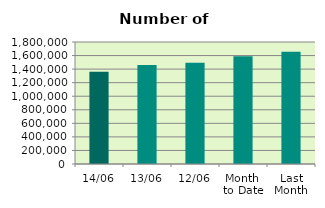
| Category | Series 0 |
|---|---|
| 14/06 | 1362150 |
| 13/06 | 1459952 |
| 12/06 | 1492058 |
| Month 
to Date | 1588742 |
| Last
Month | 1656073.545 |